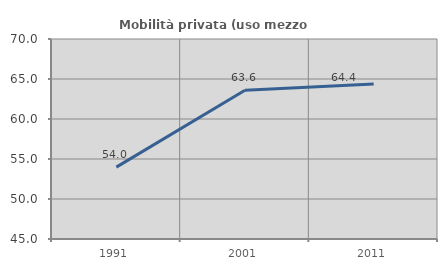
| Category | Mobilità privata (uso mezzo privato) |
|---|---|
| 1991.0 | 53.982 |
| 2001.0 | 63.59 |
| 2011.0 | 64.362 |